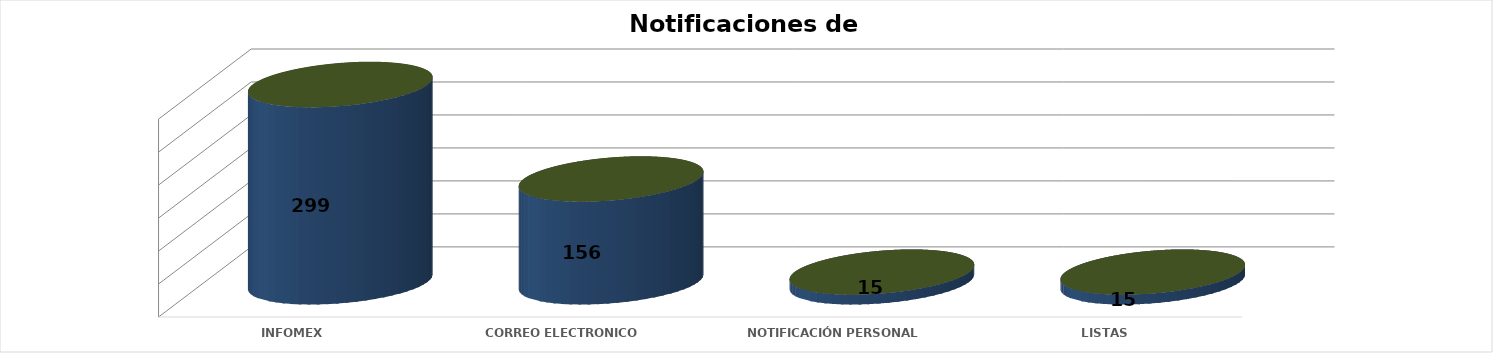
| Category | Series 0 | Series 1 | Series 2 | Series 3 | Series 4 |
|---|---|---|---|---|---|
| INFOMEX |  |  |  | 299 | 0.616 |
| CORREO ELECTRONICO |  |  |  | 156 | 0.322 |
| NOTIFICACIÓN PERSONAL |  |  |  | 15 | 0.031 |
| LISTAS |  |  |  | 15 | 0.031 |